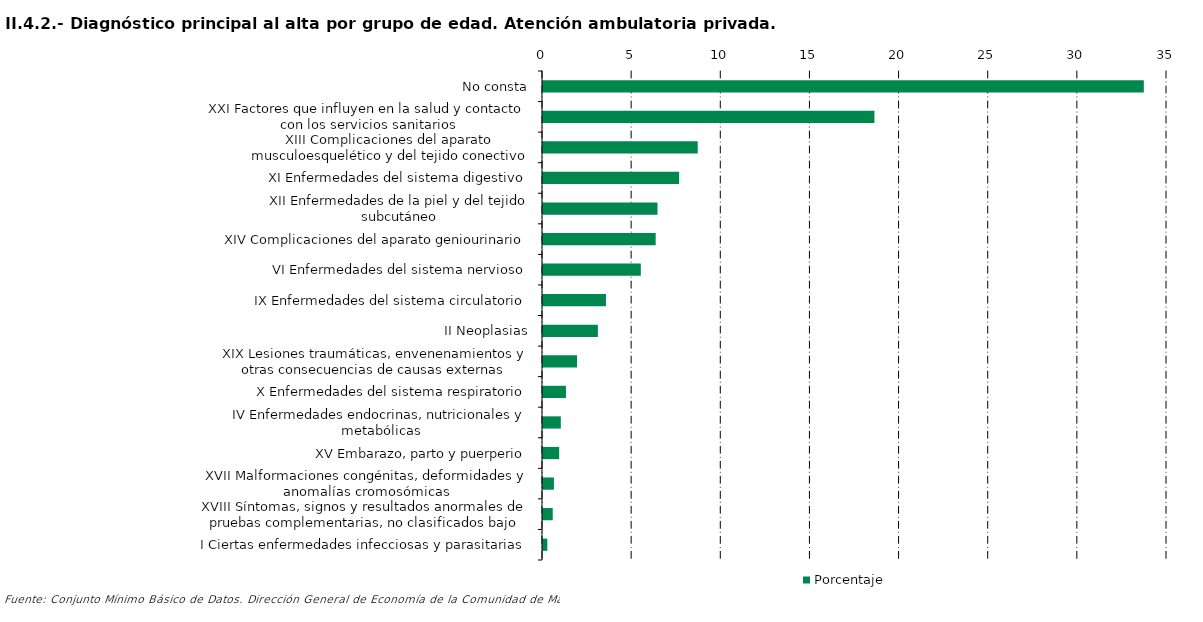
| Category | Porcentaje |
|---|---|
| No consta | 33.7 |
| XXI Factores que influyen en la salud y contacto con los servicios sanitarios | 18.59 |
| XIII Complicaciones del aparato musculoesquelético y del tejido conectivo | 8.678 |
| XI Enfermedades del sistema digestivo | 7.633 |
| XII Enfermedades de la piel y del tejido subcutáneo | 6.421 |
| XIV Complicaciones del aparato geniourinario | 6.32 |
| VI Enfermedades del sistema nervioso | 5.486 |
| IX Enfermedades del sistema circulatorio | 3.531 |
| II Neoplasias | 3.078 |
| XIX Lesiones traumáticas, envenenamientos y otras consecuencias de causas externas | 1.908 |
| X Enfermedades del sistema respiratorio | 1.288 |
| IV Enfermedades endocrinas, nutricionales y metabólicas | 0.999 |
| XV Embarazo, parto y puerperio | 0.908 |
| XVII Malformaciones congénitas, deformidades y anomalías cromosómicas | 0.613 |
| XVIII Síntomas, signos y resultados anormales de pruebas complementarias, no clasificados bajo otro concepto | 0.546 |
| I Ciertas enfermedades infecciosas y parasitarias | 0.243 |